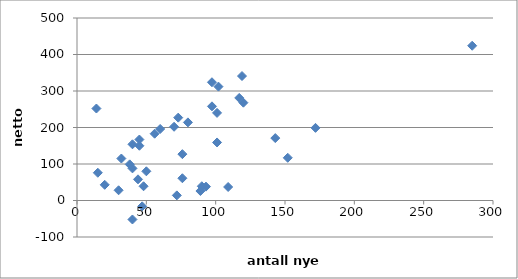
| Category | Series 0 |
|---|---|
| 48.0 | 39 |
| 152.0 | 117 |
| 93.0 | 38 |
| 89.0 | 26 |
| 172.0 | 199 |
| 143.0 | 171 |
| 120.0 | 268 |
| 285.0 | 424 |
| 101.0 | 240 |
| 102.0 | 312 |
| 119.0 | 341 |
| 117.0 | 281 |
| 76.0 | 61 |
| 90.0 | 39 |
| 40.0 | -52 |
| 32.0 | 115 |
| 73.0 | 227 |
| 30.0 | 28 |
| 38.0 | 99 |
| 44.0 | 58 |
| 80.0 | 214 |
| 97.33333333333333 | 324 |
| 97.33333333333333 | 258 |
| 47.0 | -16 |
| 40.0 | 154 |
| 50.0 | 80 |
| 20.0 | 43 |
| 15.0 | 76 |
| 14.0 | 252 |
| 101.0 | 159 |
| 109.0 | 37 |
| 56.0 | 183 |
| 45.0 | 150 |
| 40.0 | 88 |
| 70.0 | 202 |
| 76.0 | 127 |
| 60.0 | 196 |
| 72.0 | 14 |
| 45.0 | 167 |